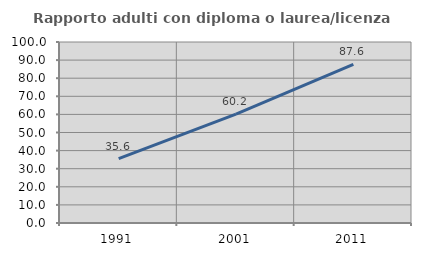
| Category | Rapporto adulti con diploma o laurea/licenza media  |
|---|---|
| 1991.0 | 35.599 |
| 2001.0 | 60.156 |
| 2011.0 | 87.64 |